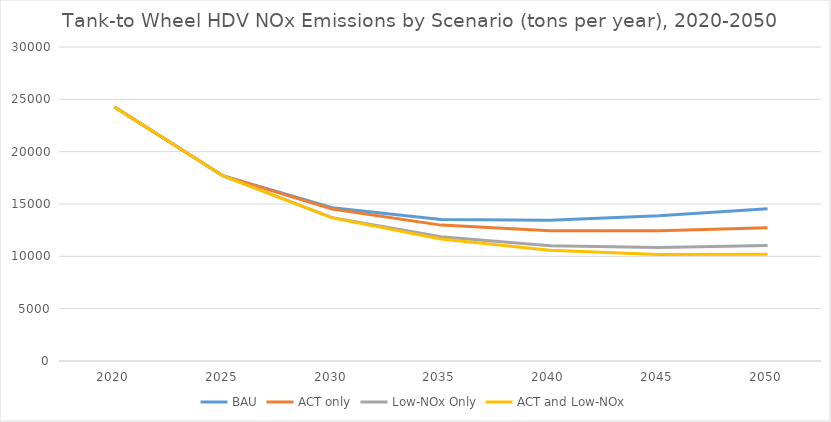
| Category | BAU | ACT only | Low-NOx Only | ACT and Low-NOx |
|---|---|---|---|---|
| 2020.0 | 24269.542 | 24269.542 | 24269.542 | 24269.542 |
| 2025.0 | 17679.519 | 17679.519 | 17679.519 | 17679.519 |
| 2030.0 | 14640.833 | 14522.221 | 13694.361 | 13675.36 |
| 2035.0 | 13527.06 | 12982.009 | 11867.231 | 11649.341 |
| 2040.0 | 13458.425 | 12453.059 | 11016.392 | 10578.077 |
| 2045.0 | 13874.766 | 12433.325 | 10849.466 | 10186.424 |
| 2050.0 | 14538.66 | 12734.029 | 11046.816 | 10197.089 |